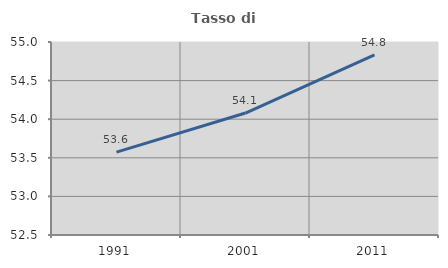
| Category | Tasso di occupazione   |
|---|---|
| 1991.0 | 53.573 |
| 2001.0 | 54.08 |
| 2011.0 | 54.833 |